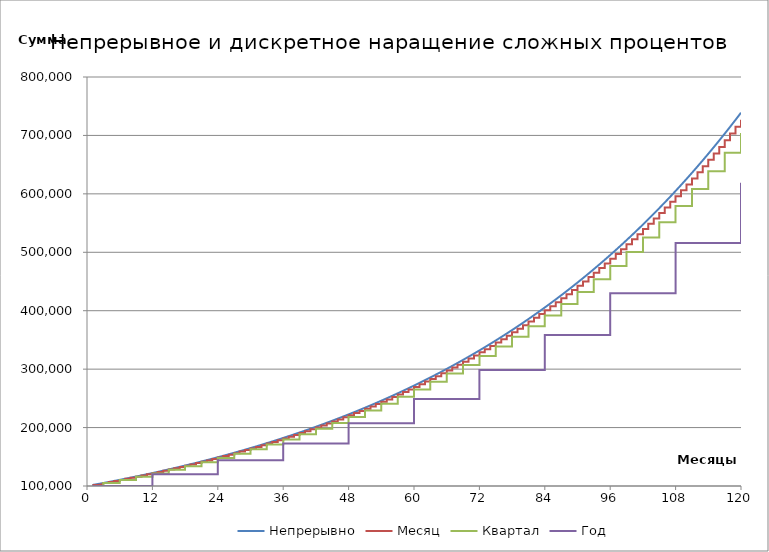
| Category | Непрерывно |
|---|---|
| 1.0 | 101680.633 |
| 2.0 | 103389.511 |
| 3.0 | 105127.11 |
| 4.0 | 106893.911 |
| 5.0 | 108690.405 |
| 6.0 | 110517.092 |
| 7.0 | 112374.479 |
| 8.0 | 114263.081 |
| 9.0 | 116183.424 |
| 10.0 | 118136.041 |
| 11.0 | 120121.475 |
| 12.0 | 122140.276 |
| 13.0 | 124193.006 |
| 14.0 | 126280.234 |
| 15.0 | 128402.542 |
| 16.0 | 130560.517 |
| 17.0 | 132754.76 |
| 18.0 | 134985.881 |
| 19.0 | 137254.498 |
| 20.0 | 139561.243 |
| 21.0 | 141906.755 |
| 22.0 | 144291.687 |
| 23.0 | 146716.7 |
| 24.0 | 149182.47 |
| 25.0 | 151689.68 |
| 26.0 | 154239.027 |
| 27.0 | 156831.219 |
| 28.0 | 159466.976 |
| 29.0 | 162147.031 |
| 30.0 | 164872.127 |
| 31.0 | 167643.023 |
| 32.0 | 170460.487 |
| 33.0 | 173325.302 |
| 34.0 | 176238.264 |
| 35.0 | 179200.183 |
| 36.0 | 182211.88 |
| 37.0 | 185274.193 |
| 38.0 | 188387.972 |
| 39.0 | 191554.083 |
| 40.0 | 194773.404 |
| 41.0 | 198046.83 |
| 42.0 | 201375.271 |
| 43.0 | 204759.65 |
| 44.0 | 208200.908 |
| 45.0 | 211700.002 |
| 46.0 | 215257.902 |
| 47.0 | 218875.597 |
| 48.0 | 222554.093 |
| 49.0 | 226294.41 |
| 50.0 | 230097.589 |
| 51.0 | 233964.685 |
| 52.0 | 237896.773 |
| 53.0 | 241894.945 |
| 54.0 | 245960.311 |
| 55.0 | 250094.001 |
| 56.0 | 254297.164 |
| 57.0 | 258570.966 |
| 58.0 | 262916.595 |
| 59.0 | 267335.258 |
| 60.0 | 271828.183 |
| 61.0 | 276396.617 |
| 62.0 | 281041.83 |
| 63.0 | 285765.112 |
| 64.0 | 290567.775 |
| 65.0 | 295451.153 |
| 66.0 | 300416.602 |
| 67.0 | 305465.503 |
| 68.0 | 310599.257 |
| 69.0 | 315819.291 |
| 70.0 | 321127.054 |
| 71.0 | 326524.022 |
| 72.0 | 332011.692 |
| 73.0 | 337591.59 |
| 74.0 | 343265.266 |
| 75.0 | 349034.296 |
| 76.0 | 354900.281 |
| 77.0 | 360864.853 |
| 78.0 | 366929.667 |
| 79.0 | 373096.408 |
| 80.0 | 379366.789 |
| 81.0 | 385742.553 |
| 82.0 | 392225.47 |
| 83.0 | 398817.341 |
| 84.0 | 405519.997 |
| 85.0 | 412335.3 |
| 86.0 | 419265.143 |
| 87.0 | 426311.452 |
| 88.0 | 433476.183 |
| 89.0 | 440761.327 |
| 90.0 | 448168.907 |
| 91.0 | 455700.982 |
| 92.0 | 463359.643 |
| 93.0 | 471147.018 |
| 94.0 | 479065.271 |
| 95.0 | 487116.6 |
| 96.0 | 495303.242 |
| 97.0 | 503627.472 |
| 98.0 | 512091.602 |
| 99.0 | 520697.983 |
| 100.0 | 529449.005 |
| 101.0 | 538347.1 |
| 102.0 | 547394.739 |
| 103.0 | 556594.436 |
| 104.0 | 565948.746 |
| 105.0 | 575460.268 |
| 106.0 | 585131.643 |
| 107.0 | 594965.559 |
| 108.0 | 604964.746 |
| 109.0 | 615131.984 |
| 110.0 | 625470.095 |
| 111.0 | 635981.952 |
| 112.0 | 646670.475 |
| 113.0 | 657538.633 |
| 114.0 | 668589.444 |
| 115.0 | 679825.979 |
| 116.0 | 691251.359 |
| 117.0 | 702868.758 |
| 118.0 | 714681.403 |
| 119.0 | 726692.574 |
| 120.0 | 738905.61 |